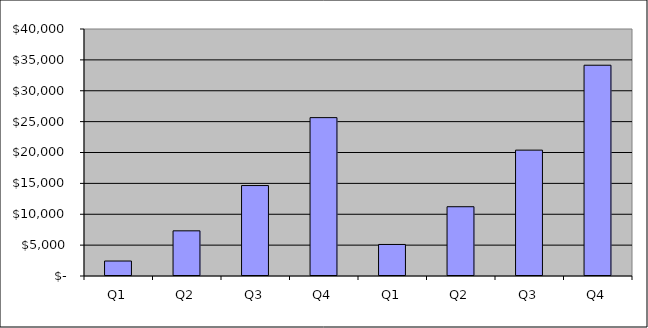
| Category | Series 0 |
|---|---|
| Q1 | 2426.14 |
| Q2 | 7314.64 |
| Q3 | 14647.39 |
| Q4 | 25646.515 |
| Q1 | 5107.79 |
| Q2 | 11218.415 |
| Q3 | 20384.352 |
| Q4 | 34133.259 |